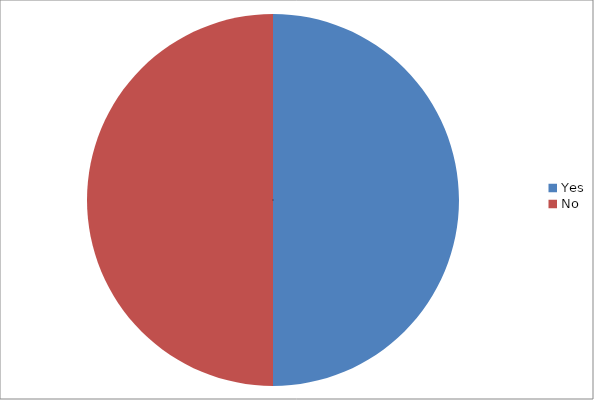
| Category | Series 0 |
|---|---|
| Yes | 13 |
| No | 13 |